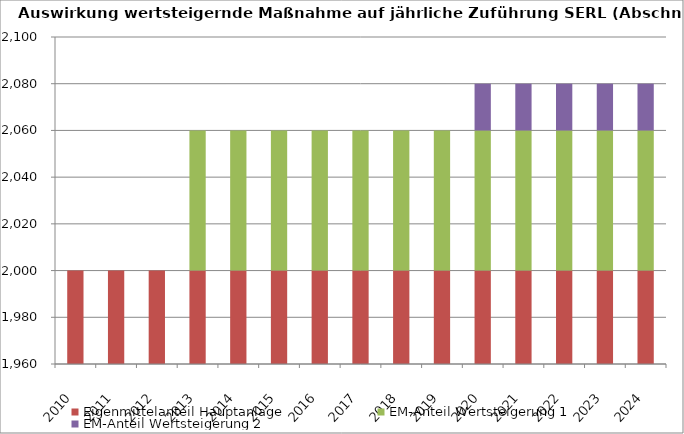
| Category | Eigenmittelanteil Hauptanlage | EM-Anteil Wertsteigerung 1 | EM-Anteil Wertsteigerung 2 |
|---|---|---|---|
| 2010.0 | 2000 | 0 | 0 |
| 2011.0 | 2000 | 0 | 0 |
| 2012.0 | 2000 | 0 | 0 |
| 2013.0 | 2000 | 60 | 0 |
| 2014.0 | 2000 | 60 | 0 |
| 2015.0 | 2000 | 60 | 0 |
| 2016.0 | 2000 | 60 | 0 |
| 2017.0 | 2000 | 60 | 0 |
| 2018.0 | 2000 | 60 | 0 |
| 2019.0 | 2000 | 60 | 0 |
| 2020.0 | 2000 | 60 | 20 |
| 2021.0 | 2000 | 60 | 20 |
| 2022.0 | 2000 | 60 | 20 |
| 2023.0 | 2000 | 60 | 20 |
| 2024.0 | 2000 | 60 | 20 |